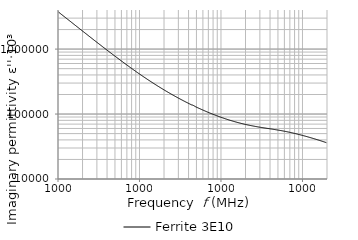
| Category | Ferrite 3E10 |
|---|---|
| 10000.0 | 3786731.074 |
| 10192.3 | 3697123.895 |
| 10388.3 | 3628755.848 |
| 10588.1 | 3561122.762 |
| 10791.8 | 3494998.533 |
| 10999.3 | 3429527.556 |
| 11210.9 | 3364980.581 |
| 11426.5 | 3301897.03 |
| 11646.2 | 3240550.936 |
| 11870.2 | 3180347.143 |
| 12098.5 | 3121218.342 |
| 12331.2 | 3063241.995 |
| 12568.4 | 3005888.823 |
| 12810.1 | 2949934.503 |
| 13056.5 | 2895272.811 |
| 13307.6 | 2841384.59 |
| 13563.5 | 2788495.038 |
| 13824.4 | 2736564.199 |
| 14090.2 | 2685077.518 |
| 14361.2 | 2634791.536 |
| 14637.4 | 2585477.532 |
| 14919.0 | 2536823.138 |
| 15205.9 | 2489121.619 |
| 15498.3 | 2442284.351 |
| 15796.4 | 2396377.482 |
| 16100.2 | 2351517.413 |
| 16409.9 | 2307238.152 |
| 16725.5 | 2263923.493 |
| 17047.1 | 2221543.756 |
| 17375.0 | 2179847.945 |
| 17709.2 | 2139067.284 |
| 18049.7 | 2099383.704 |
| 18396.9 | 2060314.542 |
| 18750.7 | 2021914.923 |
| 19111.3 | 1984260.023 |
| 19478.9 | 1947384.283 |
| 19853.5 | 1911131.367 |
| 20235.3 | 1875567.149 |
| 20624.5 | 1840765.926 |
| 21021.2 | 1806432.778 |
| 21425.5 | 1772614.32 |
| 21837.5 | 1739793.166 |
| 22257.5 | 1707481.077 |
| 22685.6 | 1675634.232 |
| 23121.9 | 1644199.736 |
| 23566.6 | 1613389.252 |
| 24019.8 | 1583216.708 |
| 24481.8 | 1553670.272 |
| 24952.6 | 1524779.426 |
| 25432.5 | 1496557.866 |
| 25921.7 | 1468960.339 |
| 26420.2 | 1441368.445 |
| 26928.3 | 1414518.325 |
| 27446.2 | 1388241.847 |
| 27974.1 | 1362603.512 |
| 28512.1 | 1337628.661 |
| 29060.5 | 1312995.441 |
| 29619.4 | 1288901.055 |
| 30189.0 | 1265332.334 |
| 30769.6 | 1241853.347 |
| 31361.4 | 1219009.864 |
| 31964.6 | 1196667.201 |
| 32579.3 | 1174766.844 |
| 33205.9 | 1153379.873 |
| 33844.5 | 1132201.006 |
| 34495.4 | 1111497.652 |
| 35158.9 | 1091146.535 |
| 35835.1 | 1071269.105 |
| 36524.3 | 1051843.636 |
| 37226.7 | 1032730.81 |
| 37942.7 | 1014002.088 |
| 38672.4 | 995603.644 |
| 39416.2 | 977526.398 |
| 40174.3 | 959770.181 |
| 40946.9 | 942327.813 |
| 41734.4 | 925385.169 |
| 42537.1 | 908754.911 |
| 43355.2 | 892357.1 |
| 44189.0 | 876301.816 |
| 45038.9 | 860478.637 |
| 45905.1 | 844887.641 |
| 46787.9 | 829723.41 |
| 47687.8 | 814909.107 |
| 48604.9 | 800365.879 |
| 49539.7 | 786041.567 |
| 50492.5 | 771907.311 |
| 51463.6 | 758184.282 |
| 52453.4 | 744646.418 |
| 53462.2 | 731393.639 |
| 54490.4 | 718388.481 |
| 55538.4 | 705655.388 |
| 56606.5 | 693171.967 |
| 57695.2 | 680924.363 |
| 58804.8 | 668913.603 |
| 59935.8 | 657161.09 |
| 61088.5 | 645517.897 |
| 62263.4 | 634176.777 |
| 63460.9 | 623044.594 |
| 64681.4 | 612183.396 |
| 65925.4 | 601582.856 |
| 67193.3 | 591166.662 |
| 68485.6 | 580987.344 |
| 69802.7 | 570934.956 |
| 71145.2 | 561014.016 |
| 72513.5 | 551254.886 |
| 73908.1 | 541638.424 |
| 75329.5 | 532310.801 |
| 76778.3 | 523258.077 |
| 78255.0 | 514362.488 |
| 79760.0 | 505632.427 |
| 81294.0 | 497083.794 |
| 82857.5 | 488671.136 |
| 84451.0 | 480391.247 |
| 86075.2 | 472287.803 |
| 87730.7 | 464375.106 |
| 89417.9 | 456510.71 |
| 91137.7 | 448724.316 |
| 92890.5 | 441243.912 |
| 94677.0 | 433960.006 |
| 96497.9 | 426805.072 |
| 98353.8 | 419813.169 |
| 100245.0 | 412959.427 |
| 102173.0 | 406270.89 |
| 104138.0 | 399645.878 |
| 106141.0 | 393147.436 |
| 108183.0 | 386798.445 |
| 110263.0 | 380589.588 |
| 112384.0 | 374493.512 |
| 114545.0 | 368508.924 |
| 116748.0 | 362637.799 |
| 118994.0 | 356863.215 |
| 121282.0 | 351191.109 |
| 123615.0 | 345648.707 |
| 125992.0 | 340149.223 |
| 128415.0 | 334766.583 |
| 130885.0 | 329515.279 |
| 133402.0 | 324397.681 |
| 135968.0 | 319391.835 |
| 138583.0 | 314457.233 |
| 141248.0 | 309594.808 |
| 143965.0 | 304809.006 |
| 146734.0 | 300145.549 |
| 149556.0 | 295562.91 |
| 152432.0 | 291060.372 |
| 155364.0 | 286661.87 |
| 158352.0 | 282335.097 |
| 161397.0 | 278095.854 |
| 164501.0 | 273947.863 |
| 167665.0 | 269888.008 |
| 170890.0 | 265903.674 |
| 174176.0 | 262003.519 |
| 177526.0 | 258183.299 |
| 180940.0 | 254413.05 |
| 184420.0 | 250691.203 |
| 187967.0 | 247034.468 |
| 191582.0 | 243476.175 |
| 195267.0 | 239967.138 |
| 199022.0 | 236524.874 |
| 202850.0 | 233129.553 |
| 206751.0 | 229814.022 |
| 210728.0 | 226570.816 |
| 214780.0 | 223413.176 |
| 218911.0 | 220300.468 |
| 223121.0 | 217234.118 |
| 227413.0 | 214222.177 |
| 231786.0 | 211272.245 |
| 236244.0 | 208383.288 |
| 240788.0 | 205543.868 |
| 245419.0 | 202743.326 |
| 250139.0 | 199997.832 |
| 254949.0 | 197296.744 |
| 259853.0 | 194660.64 |
| 264850.0 | 192081.153 |
| 269944.0 | 189544.83 |
| 275136.0 | 187043.295 |
| 280427.0 | 184586.857 |
| 285821.0 | 182175.895 |
| 291318.0 | 179812.324 |
| 296920.0 | 177507.717 |
| 302631.0 | 175218.073 |
| 308451.0 | 172986.361 |
| 314383.0 | 170780.374 |
| 320430.0 | 168621.259 |
| 326593.0 | 166488.436 |
| 332874.0 | 164397.352 |
| 339276.0 | 162341.985 |
| 345801.0 | 160322.772 |
| 352451.0 | 158342.426 |
| 359230.0 | 156393.001 |
| 366139.0 | 154484.163 |
| 373181.0 | 152598.247 |
| 380358.0 | 150738.051 |
| 387673.0 | 149082.399 |
| 395129.0 | 147127.049 |
| 402728.0 | 145378.254 |
| 410474.0 | 143649.123 |
| 418368.0 | 141954.153 |
| 426414.0 | 140284.171 |
| 434615.0 | 138649.003 |
| 442974.0 | 138054.285 |
| 451494.0 | 136756.017 |
| 460177.0 | 135321.267 |
| 469027.0 | 133753.29 |
| 478048.0 | 131404.688 |
| 487242.0 | 129724.145 |
| 496613.0 | 128258.036 |
| 506164.0 | 126836.639 |
| 515899.0 | 125440.696 |
| 525821.0 | 124064.071 |
| 535934.0 | 122711.593 |
| 546241.0 | 121392.721 |
| 556746.0 | 120082.197 |
| 567454.0 | 118792.7 |
| 578368.0 | 117536.383 |
| 589491.0 | 116280.239 |
| 600828.0 | 115075.77 |
| 612384.0 | 113879.433 |
| 624162.0 | 112706.443 |
| 636166.0 | 111554.952 |
| 648401.0 | 110407.823 |
| 660871.0 | 109274.282 |
| 673581.0 | 108179.629 |
| 686536.0 | 107100.684 |
| 699740.0 | 106040.043 |
| 713198.0 | 104992.447 |
| 726914.0 | 103962.795 |
| 740894.0 | 102957.74 |
| 755144.0 | 101963.804 |
| 769667.0 | 100990.826 |
| 784470.0 | 100032.694 |
| 799557.0 | 99086.862 |
| 814934.0 | 98160.323 |
| 830608.0 | 97250.669 |
| 846582.0 | 96354.66 |
| 862864.0 | 95480.971 |
| 879459.0 | 94616.572 |
| 896373.0 | 93766.889 |
| 913613.0 | 92927.828 |
| 931184.0 | 92105.669 |
| 949093.0 | 91306.313 |
| 967346.0 | 90514.724 |
| 985951.0 | 89738.088 |
| 1004910.0 | 89034.249 |
| 1024240.0 | 88289.101 |
| 1043940.0 | 87552.351 |
| 1064020.0 | 86829.029 |
| 1084480.0 | 86123.96 |
| 1105340.0 | 85430.84 |
| 1126600.0 | 84748.649 |
| 1148260.0 | 84077.015 |
| 1170350.0 | 83422.578 |
| 1192860.0 | 82774.395 |
| 1215800.0 | 82136.18 |
| 1239180.0 | 81507.273 |
| 1263010.0 | 80895.107 |
| 1287300.0 | 80294.933 |
| 1312060.0 | 79706.526 |
| 1337300.0 | 79128.132 |
| 1363010.0 | 78550.417 |
| 1389230.0 | 78005.761 |
| 1415950.0 | 77462.646 |
| 1443180.0 | 76926.817 |
| 1470940.0 | 76404.386 |
| 1499230.0 | 75883.72 |
| 1528060.0 | 75379.588 |
| 1557450.0 | 74877.683 |
| 1587400.0 | 74391.206 |
| 1617930.0 | 73910.664 |
| 1649050.0 | 73440.284 |
| 1680760.0 | 72983.669 |
| 1713090.0 | 72533.971 |
| 1746040.0 | 72097.021 |
| 1779620.0 | 71659.134 |
| 1813840.0 | 71242.894 |
| 1848730.0 | 70827.604 |
| 1884280.0 | 70421.527 |
| 1920520.0 | 70022.549 |
| 1957460.0 | 69629.71 |
| 1995110.0 | 69247.756 |
| 2033480.0 | 68864.943 |
| 2072580.0 | 68495.356 |
| 2112450.0 | 68149.048 |
| 2153070.0 | 67823.814 |
| 2194480.0 | 67488.196 |
| 2236690.0 | 67156.326 |
| 2279700.0 | 66827.741 |
| 2323550.0 | 66504.407 |
| 2368240.0 | 66192.749 |
| 2413780.0 | 65888.194 |
| 2460210.0 | 65585.689 |
| 2507520.0 | 65278.591 |
| 2555750.0 | 64988.468 |
| 2604900.0 | 64703.096 |
| 2655000.0 | 64418.161 |
| 2706060.0 | 64146.886 |
| 2758110.0 | 63869.694 |
| 2811150.0 | 63594.527 |
| 2865220.0 | 63316.364 |
| 2920320.0 | 63029.557 |
| 2976490.0 | 62787.058 |
| 3033730.0 | 62583.498 |
| 3092080.0 | 62338.897 |
| 3151550.0 | 62096.961 |
| 3212160.0 | 61859.12 |
| 3273940.0 | 61620.637 |
| 3336900.0 | 61382.027 |
| 3401080.0 | 61149.282 |
| 3466490.0 | 60918.979 |
| 3533160.0 | 60686.823 |
| 3601110.0 | 60455.874 |
| 3670370.0 | 60235.162 |
| 3740960.0 | 60039.801 |
| 3812910.0 | 59819.171 |
| 3886240.0 | 59616.62 |
| 3960980.0 | 59394.184 |
| 4037160.0 | 59173.493 |
| 4114810.0 | 58961.59 |
| 4193950.0 | 58743.205 |
| 4274610.0 | 58515.306 |
| 4356820.0 | 58295.267 |
| 4440610.0 | 58070.746 |
| 4526010.0 | 57850.636 |
| 4613060.0 | 57625.797 |
| 4701780.0 | 57401.445 |
| 4792210.0 | 57182.751 |
| 4884370.0 | 56953.102 |
| 4978310.0 | 56723.252 |
| 5074060.0 | 56496.635 |
| 5171640.0 | 56274.153 |
| 5271110.0 | 56042.413 |
| 5372480.0 | 55803.604 |
| 5475810.0 | 55570.538 |
| 5581120.0 | 55330.896 |
| 5688460.0 | 55090.357 |
| 5797870.0 | 54844.823 |
| 5909370.0 | 54598.59 |
| 6023030.0 | 54348.362 |
| 6138860.0 | 54096.77 |
| 6256930.0 | 53843.771 |
| 6377270.0 | 53581.063 |
| 6499920.0 | 53315.257 |
| 6624930.0 | 53061.73 |
| 6752340.0 | 52800.446 |
| 6882200.0 | 52553.86 |
| 7014570.0 | 52288.298 |
| 7149470.0 | 52003.027 |
| 7286980.0 | 51723.353 |
| 7427120.0 | 51446.35 |
| 7569960.0 | 51167.334 |
| 7715550.0 | 50881.579 |
| 7863940.0 | 50596.59 |
| 8015190.0 | 50310.537 |
| 8169340.0 | 50023.869 |
| 8326450.0 | 49735.901 |
| 8486590.0 | 49445.793 |
| 8649810.0 | 49153.999 |
| 8816170.0 | 48864.479 |
| 8985730.0 | 48565.479 |
| 9158540.0 | 48273.309 |
| 9334690.0 | 47975.964 |
| 9514210.0 | 47680.385 |
| 9697200.0 | 47382.191 |
| 9883700.0 | 47081.094 |
| 10073800.0 | 46780.694 |
| 10267500.0 | 46483.006 |
| 10465000.0 | 46183.24 |
| 10666300.0 | 45880.286 |
| 10871400.0 | 45574.135 |
| 11080500.0 | 45272.265 |
| 11293600.0 | 44975.365 |
| 11510800.0 | 44673.902 |
| 11732200.0 | 44369.12 |
| 11957800.0 | 44066.918 |
| 12187800.0 | 43766.634 |
| 12422200.0 | 43468.37 |
| 12661100.0 | 43163.964 |
| 12904600.0 | 42861.612 |
| 13152800.0 | 42559.942 |
| 13405800.0 | 42260.454 |
| 13663600.0 | 41959.424 |
| 13926400.0 | 41655.963 |
| 14194200.0 | 41354.295 |
| 14467200.0 | 41053.973 |
| 14745400.0 | 40743.698 |
| 15029000.0 | 40450.196 |
| 15318100.0 | 40155.114 |
| 15612700.0 | 39863.335 |
| 15913000.0 | 39566.891 |
| 16219000.0 | 39268.554 |
| 16530900.0 | 38968.35 |
| 16848900.0 | 38668.762 |
| 17172900.0 | 38370.22 |
| 17503200.0 | 38073.183 |
| 17839800.0 | 37774.573 |
| 18182900.0 | 37472.868 |
| 18532600.0 | 37173.391 |
| 18889100.0 | 36872.236 |
| 19252300.0 | 36577.633 |
| 19622600.0 | 36279.199 |